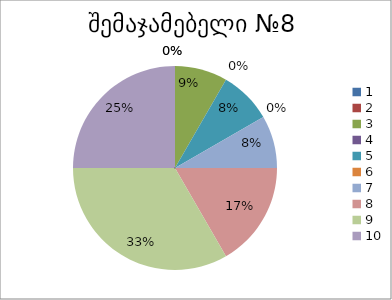
| Category | რაოდენობა | ქულა |
|---|---|---|
| 0 | 0 | 1 |
| 1 | 0 | 2 |
| 2 | 1 | 3 |
| 3 | 0 | 4 |
| 4 | 1 | 5 |
| 5 | 0 | 6 |
| 6 | 1 | 7 |
| 7 | 2 | 8 |
| 8 | 4 | 9 |
| 9 | 3 | 10 |